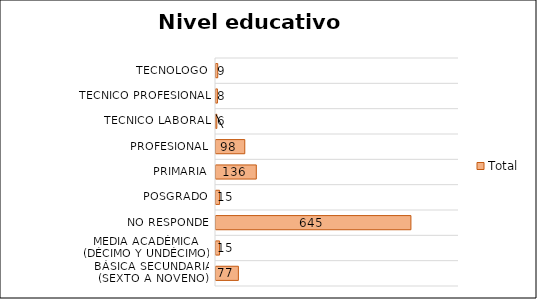
| Category | Total |
|---|---|
| Básica secundaria (sexto a noveno) | 77 |
| Media académica (décimo y undécimo) | 15 |
| No responde | 645 |
| Posgrado | 15 |
| Primaria | 136 |
| Profesional | 98 |
| Técnico laboral | 6 |
| Técnico profesional | 8 |
| Tecnólogo | 9 |